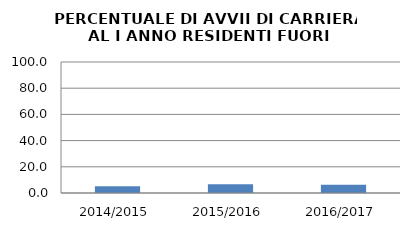
| Category | 2014/2015 2015/2016 2016/2017 |
|---|---|
| 2014/2015 | 5.085 |
| 2015/2016 | 6.742 |
| 2016/2017 | 6.25 |